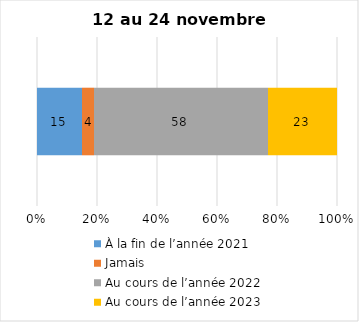
| Category | À la fin de l’année 2021 | Jamais | Au cours de l’année 2022 | Au cours de l’année 2023 |
|---|---|---|---|---|
| 0 | 15 | 4 | 58 | 23 |